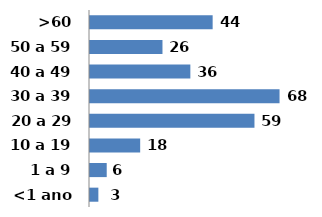
| Category | Series 0 |
|---|---|
| <1 ano | 3 |
| 1 a 9 | 6 |
| 10 a 19 | 18 |
| 20 a 29  | 59 |
| 30 a 39 | 68 |
| 40 a 49 | 36 |
| 50 a 59 | 26 |
| >60 | 44 |